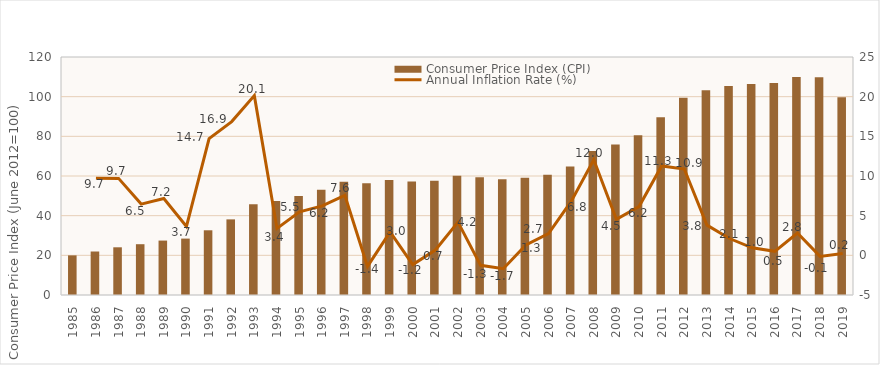
| Category | Consumer Price Index (CPI) |
|---|---|
| 1985.0 | 19.98 |
| 1986.0 | 21.93 |
| 1987.0 | 24.05 |
| 1988.0 | 25.61 |
| 1989.0 | 27.44 |
| 1990.0 | 28.44 |
| 1991.0 | 32.63 |
| 1992.0 | 38.13 |
| 1993.0 | 45.8 |
| 1994.0 | 47.35 |
| 1995.0 | 49.95 |
| 1996.0 | 53.07 |
| 1997.0 | 57.09 |
| 1998.0 | 56.29 |
| 1999.0 | 57.95 |
| 2000.0 | 57.27 |
| 2001.0 | 57.66 |
| 2002.0 | 60.07 |
| 2003.0 | 59.31 |
| 2004.0 | 58.31 |
| 2005.0 | 59.07 |
| 2006.0 | 60.68 |
| 2007.0 | 64.81 |
| 2008.0 | 72.61 |
| 2009.0 | 75.9 |
| 2010.0 | 80.57 |
| 2011.0 | 89.65 |
| 2012.0 | 99.41 |
| 2013.0 | 103.193 |
| 2014.0 | 105.381 |
| 2015.0 | 106.38 |
| 2016.0 | 106.92 |
| 2017.0 | 109.932 |
| 2018.0 | 109.785 |
| 2019.0 | 99.704 |